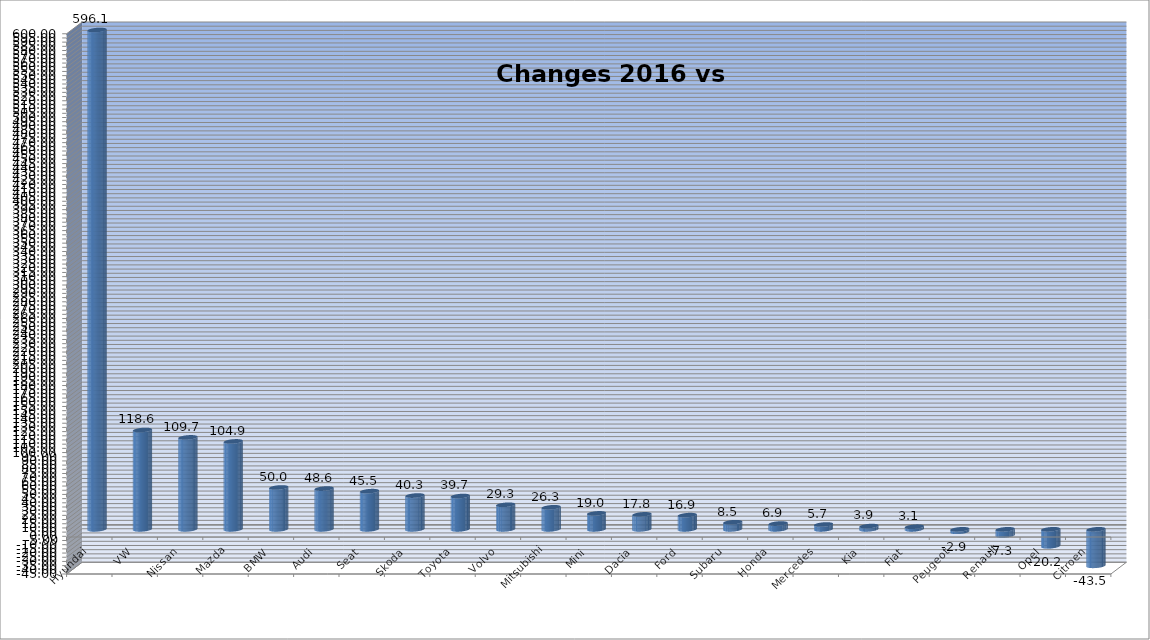
| Category | Ytd 2015 |
|---|---|
| Hyundai | 596.117 |
| VW | 118.554 |
| Nissan | 109.74 |
| Mazda | 104.93 |
| BMW | 49.953 |
| Audi | 48.637 |
| Seat | 45.531 |
| Skoda | 40.321 |
| Toyota | 39.708 |
| Volvo | 29.294 |
| Mitsubishi | 26.3 |
| Mini | 19.014 |
| Dacia | 17.834 |
| Ford | 16.918 |
| Subaru | 8.468 |
| Honda | 6.878 |
| Mercedes | 5.733 |
| Kia | 3.855 |
| Fiat | 3.125 |
| Peugeot | -2.891 |
| Renault | -7.28 |
| Opel | -20.165 |
| Citroen | -43.531 |